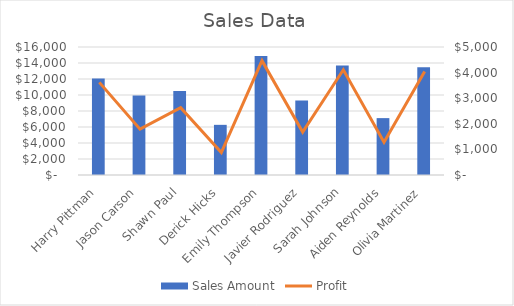
| Category | Sales Amount |
|---|---|
| Harry Pittman | 12060 |
| Jason Carson | 9950 |
| Shawn Paul | 10510 |
| Derick Hicks | 6270 |
| Emily Thompson | 14890 |
| Javier Rodriguez | 9320 |
| Sarah Johnson | 13700 |
| Aiden Reynolds | 7110 |
| Olivia Martinez | 13480 |